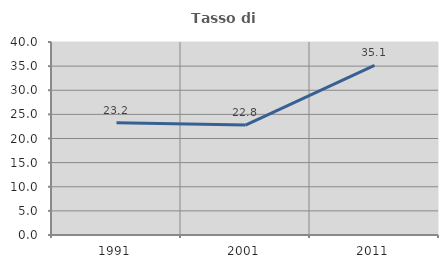
| Category | Tasso di occupazione   |
|---|---|
| 1991.0 | 23.245 |
| 2001.0 | 22.79 |
| 2011.0 | 35.149 |